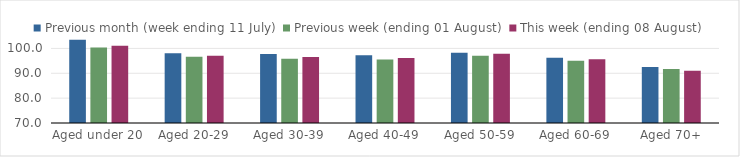
| Category | Previous month (week ending 11 July) | Previous week (ending 01 August) | This week (ending 08 August) |
|---|---|---|---|
| Aged under 20 | 103.496 | 100.396 | 101.058 |
| Aged 20-29 | 98.078 | 96.619 | 97.064 |
| Aged 30-39 | 97.709 | 95.898 | 96.516 |
| Aged 40-49 | 97.27 | 95.587 | 96.102 |
| Aged 50-59 | 98.284 | 97.073 | 97.882 |
| Aged 60-69 | 96.217 | 95.002 | 95.688 |
| Aged 70+ | 92.562 | 91.736 | 91.041 |